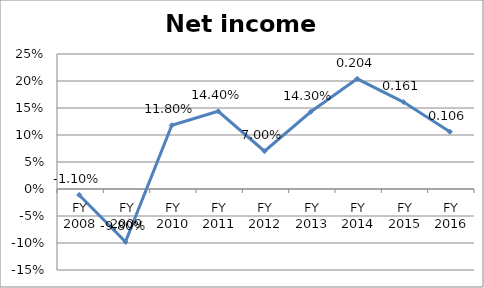
| Category | Net income ratio |
|---|---|
| FY 2016 | 0.106 |
| FY 2015 | 0.161 |
| FY 2014 | 0.204 |
| FY 2013 | 0.143 |
| FY 2012 | 0.07 |
| FY 2011 | 0.144 |
| FY 2010 | 0.118 |
| FY 2009 | -0.098 |
| FY 2008 | -0.011 |